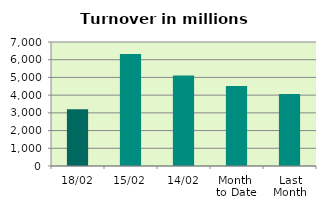
| Category | Series 0 |
|---|---|
| 18/02 | 3209.775 |
| 15/02 | 6316.906 |
| 14/02 | 5115.572 |
| Month 
to Date | 4522.012 |
| Last
Month | 4067.116 |